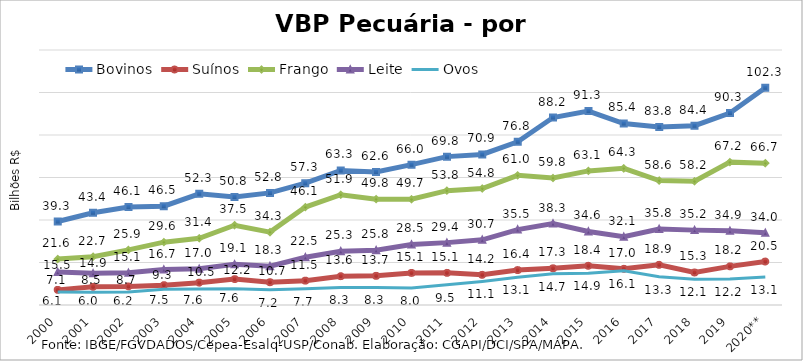
| Category | Bovinos | Suínos | Frango | Leite | Ovos |
|---|---|---|---|---|---|
| 2000 | 39.293 | 7.115 | 21.621 | 15.52 | 6.068 |
| 2001 | 43.435 | 8.536 | 22.726 | 14.935 | 5.98 |
| 2002 | 46.093 | 8.748 | 25.94 | 15.123 | 6.161 |
| 2003 | 46.519 | 9.35 | 29.574 | 16.654 | 7.452 |
| 2004 | 52.34 | 10.512 | 31.404 | 17.021 | 7.553 |
| 2005 | 50.815 | 12.188 | 37.545 | 19.143 | 7.604 |
| 2006 | 52.758 | 10.721 | 34.299 | 18.285 | 7.223 |
| 2007 | 57.336 | 11.464 | 46.085 | 22.479 | 7.677 |
| 2008 | 63.305 | 13.574 | 51.876 | 25.288 | 8.291 |
| 2009 | 62.645 | 13.722 | 49.809 | 25.781 | 8.267 |
| 2010 | 66.047 | 15.095 | 49.749 | 28.472 | 8.04 |
| 2011 | 69.822 | 15.119 | 53.805 | 29.351 | 9.474 |
| 2012 | 70.863 | 14.196 | 54.81 | 30.67 | 11.106 |
| 2013 | 76.79 | 16.437 | 61.004 | 35.492 | 13.062 |
| 2014 | 88.218 | 17.264 | 59.77 | 38.326 | 14.676 |
| 2015 | 91.254 | 18.449 | 63.099 | 34.596 | 14.943 |
| 2016 | 85.418 | 17.026 | 64.293 | 32.101 | 16.11 |
| 2017 | 83.823 | 18.901 | 58.56 | 35.767 | 13.279 |
| 2018 | 84.385 | 15.307 | 58.241 | 35.236 | 12.075 |
| 2019 | 90.336 | 18.187 | 67.234 | 34.907 | 12.202 |
| 2020** | 102.262 | 20.457 | 66.743 | 34.002 | 13.145 |